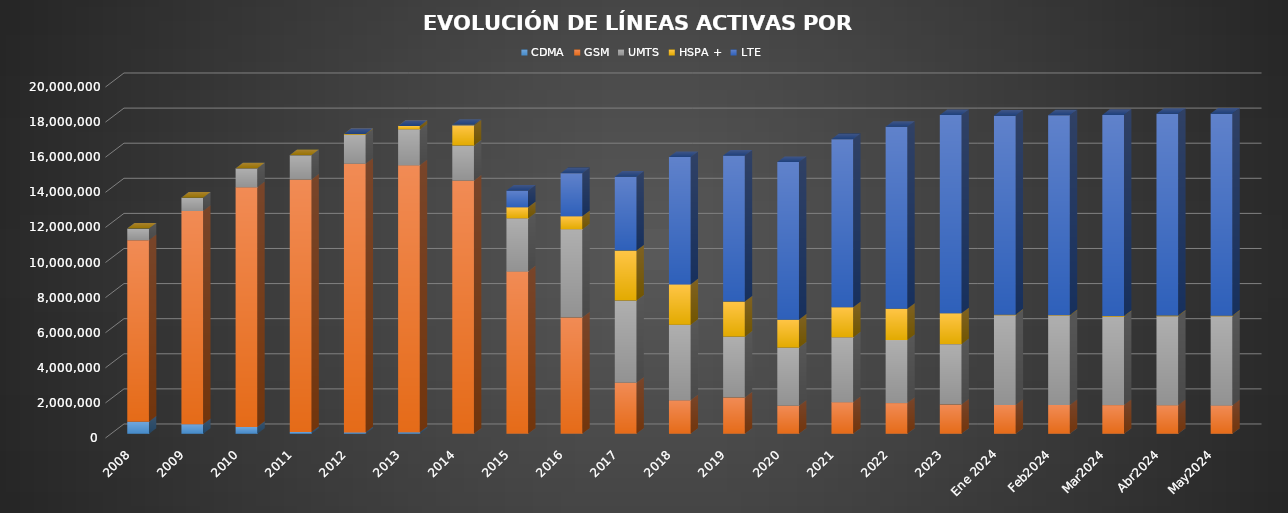
| Category | CDMA | GSM | UMTS | HSPA + | LTE |
|---|---|---|---|---|---|
| 2008 | 688357 | 10346902 | 656989 | 0 | 0 |
| 2009 | 544313 | 12151710 | 758577 | 0 | 0 |
| 2010 | 389834 | 13657394 | 1071603 | 0 | 0 |
| 2011 | 102115 | 14379423 | 1393020 | 0 | 0 |
| 2012 | 75179 | 15310006 | 1658596 | 43082 | 0 |
| 2013 | 83748 | 15215287 | 2043321 | 199398 | 0 |
| 2014 | 3009 | 14418144 | 2006405 | 1148823 | 28176 |
| 2015 | 0 | 9252920 | 3019889 | 636488 | 949723 |
| 2016 | 0 | 6621574 | 5027714 | 748032 | 2450814 |
| 2017 | 0 | 2903370.634 | 4688270.066 | 2852941.199 | 4206822.101 |
| 2018 | 0 | 1909938.891 | 4302462.415 | 2301651 | 7258785.694 |
| 2019 | 0 | 2068130.505 | 3468519.705 | 1995507 | 8320942.79 |
| 2020 | 0 | 1595680.621 | 3315009.099 | 1591073 | 8983603.28 |
| 2021 | 0 | 1804531 | 3688873 | 1717066 | 9579130 |
| 2022 | 0 | 1749209.536 | 3590258.283 | 1786029 | 10365254.181 |
| 2023 | 0 | 1668877.551 | 3437383.873 | 1762453 | 11296897.576 |
| Ene 2024 | 0 | 1645802.743 | 5104715.025 | 39987 | 11339124.231 |
| Feb2024 | 0 | 1639335.297 | 5081206.083 | 39954 | 11388619.62 |
| Mar2024 | 0 | 1634223.732 | 5038484.414 | 39942 | 11460126.854 |
| Abr2024 | 0 | 1632191.778 | 5065128.153 | 39501 | 11498296.069 |
| May2024 | 0 | 1615518.082 | 5079153.034 | 37945 | 11517427.884 |